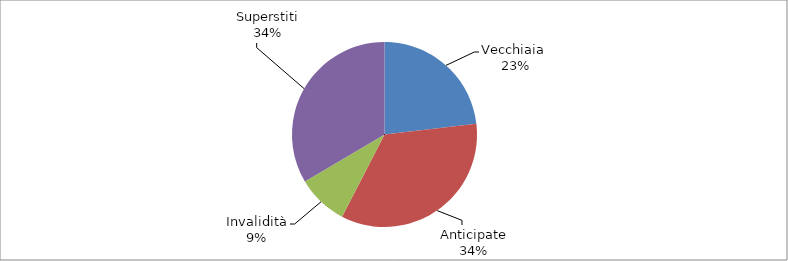
| Category | Series 0 |
|---|---|
| Vecchiaia  | 89190 |
| Anticipate | 132677 |
| Invalidità | 34347 |
| Superstiti | 129102 |